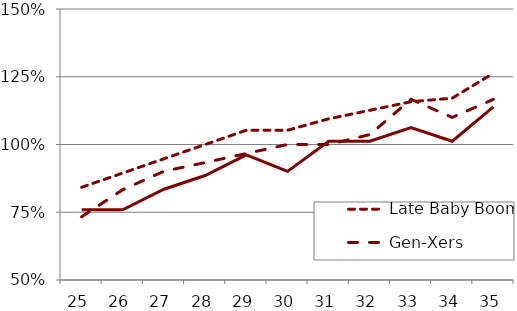
| Category | Late Baby Boomers | Gen-Xers | Millennials |
|---|---|---|---|
| 25.0 | 0.842 | 0.733 | 0.759 |
| 26.0 | 0.895 | 0.833 | 0.759 |
| 27.0 | 0.947 | 0.901 | 0.835 |
| 28.0 | 1 | 0.933 | 0.886 |
| 29.0 | 1.053 | 0.967 | 0.962 |
| 30.0 | 1.053 | 1 | 0.901 |
| 31.0 | 1.095 | 1 | 1.012 |
| 32.0 | 1.126 | 1.037 | 1.012 |
| 33.0 | 1.158 | 1.167 | 1.063 |
| 34.0 | 1.171 | 1.1 | 1.012 |
| 35.0 | 1.263 | 1.167 | 1.139 |